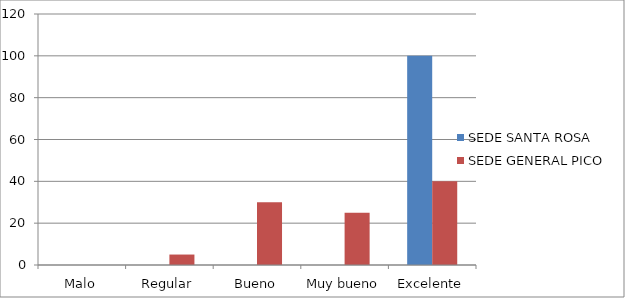
| Category | SEDE SANTA ROSA | SEDE GENERAL PICO |
|---|---|---|
| Malo | 0 | 0 |
| Regular | 0 | 5 |
| Bueno | 0 | 30 |
| Muy bueno | 0 | 25 |
| Excelente | 100 | 40 |